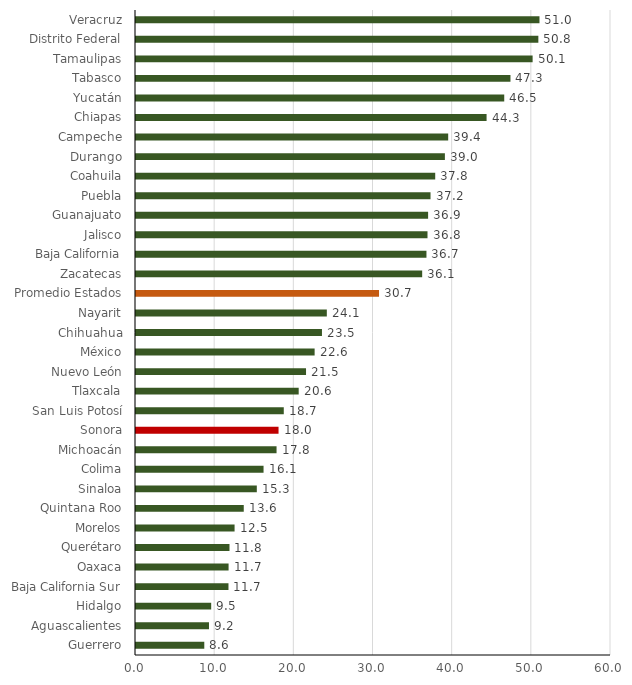
| Category | Proporción Gasto Corriente del Total |
|---|---|
| Guerrero | 8.626 |
| Aguascalientes | 9.219 |
| Hidalgo | 9.498 |
| Baja California Sur | 11.682 |
| Oaxaca | 11.695 |
| Querétaro | 11.81 |
| Morelos | 12.452 |
| Quintana Roo | 13.612 |
| Sinaloa | 15.26 |
| Colima | 16.111 |
| Michoacán | 17.754 |
| Sonora | 18.005 |
| San Luis Potosí | 18.667 |
| Tlaxcala | 20.551 |
| Nuevo León | 21.478 |
| México | 22.563 |
| Chihuahua | 23.49 |
| Nayarit | 24.104 |
| Promedio Estados | 30.698 |
| Zacatecas | 36.149 |
| Baja California | 36.689 |
| Jalisco | 36.821 |
| Guanajuato | 36.898 |
| Puebla | 37.203 |
| Coahuila | 37.796 |
| Durango | 39.018 |
| Campeche | 39.435 |
| Chiapas | 44.284 |
| Yucatán | 46.515 |
| Tabasco | 47.301 |
| Tamaulipas | 50.099 |
| Distrito Federal | 50.823 |
| Veracruz | 50.966 |